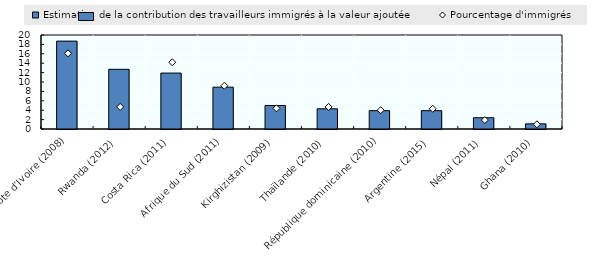
| Category | Estimation de la contribution des travailleurs immigrés à la valeur ajoutée  |
|---|---|
| Côte d’Ivoire (2008) | 18.7 |
| Rwanda (2012) | 12.7 |
| Costa Rica (2011) | 11.9 |
| Afrique du Sud (2011) | 8.9 |
| Kirghizistan (2009) | 5 |
| Thaïlande (2010) | 4.3 |
| République dominicaine (2010) | 3.9 |
| Argentine (2015) | 3.9 |
| Népal (2011) | 2.4 |
| Ghana (2010) | 1.1 |